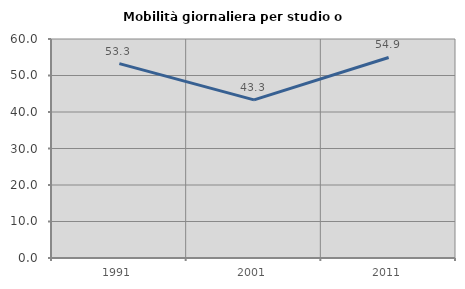
| Category | Mobilità giornaliera per studio o lavoro |
|---|---|
| 1991.0 | 53.265 |
| 2001.0 | 43.318 |
| 2011.0 | 54.933 |